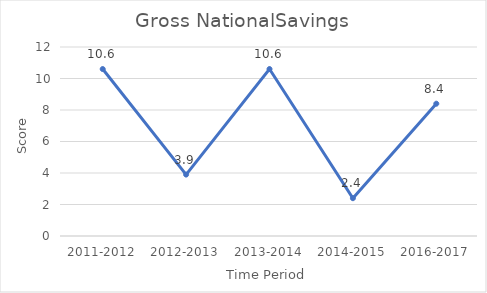
| Category | Series 0 |
|---|---|
| 2011-2012 | 10.6 |
| 2012-2013 | 3.9 |
| 2013-2014 | 10.6 |
| 2014-2015 | 2.4 |
| 2016-2017 | 8.4 |